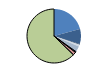
| Category | Series 0 |
|---|---|
| ARRASTRE | 242 |
| CERCO | 105 |
| ATUNEROS CAÑEROS | 5 |
| PALANGRE DE FONDO | 13 |
| PALANGRE DE SUPERFICIE | 34 |
| RASCO | 6 |
| VOLANTA | 6 |
| ARTES FIJAS | 22 |
| ARTES MENORES | 730 |